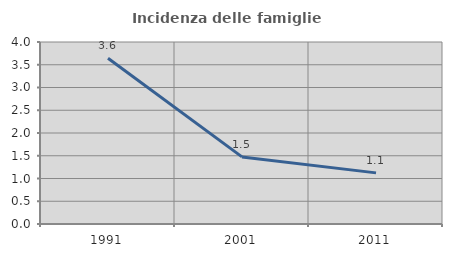
| Category | Incidenza delle famiglie numerose |
|---|---|
| 1991.0 | 3.641 |
| 2001.0 | 1.475 |
| 2011.0 | 1.124 |